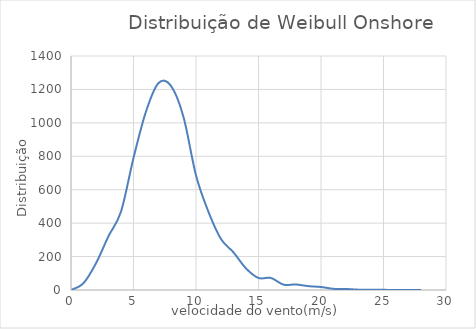
| Category | Distribuição de Weibull(f(u)) Onshore   |
|---|---|
| 0.0 | 0 |
| 1.0 | 41 |
| 2.0 | 160 |
| 3.0 | 322 |
| 4.0 | 469 |
| 5.0 | 790 |
| 6.0 | 1068 |
| 7.0 | 1238 |
| 8.0 | 1221 |
| 9.0 | 1035 |
| 10.0 | 686 |
| 11.0 | 467 |
| 12.0 | 305 |
| 13.0 | 225 |
| 14.0 | 129 |
| 15.0 | 72 |
| 16.0 | 72 |
| 17.0 | 32 |
| 18.0 | 33 |
| 19.0 | 23 |
| 20.0 | 18 |
| 21.0 | 7 |
| 22.0 | 6 |
| 23.0 | 2 |
| 24.0 | 2 |
| 25.0 | 1 |
| 26.0 | 0 |
| 27.0 | 0 |
| 28.0 | 0 |